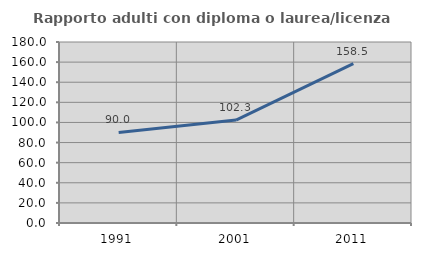
| Category | Rapporto adulti con diploma o laurea/licenza media  |
|---|---|
| 1991.0 | 90.038 |
| 2001.0 | 102.326 |
| 2011.0 | 158.466 |